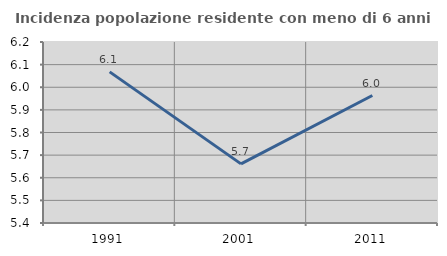
| Category | Incidenza popolazione residente con meno di 6 anni |
|---|---|
| 1991.0 | 6.068 |
| 2001.0 | 5.661 |
| 2011.0 | 5.963 |